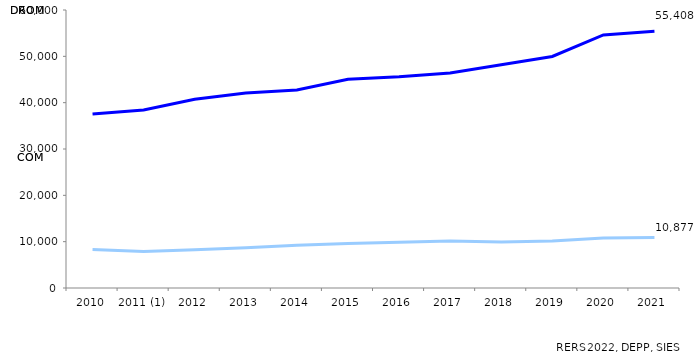
| Category | DROM | COM |
|---|---|---|
| 2010 | 37549 | 8311 |
| 2011 (1) | 38417 | 7867 |
| 2012 | 40719 | 8242 |
| 2013 | 42092 | 8666 |
| 2014 | 42745 | 9215 |
| 2015 | 45037 | 9586 |
| 2016 | 45583 | 9875 |
| 2017 | 46398 | 10132 |
| 2018 | 48205 | 9949 |
| 2019 | 49969 | 10136 |
| 2020 | 54627 | 10778 |
| 2021 | 55408 | 10877 |